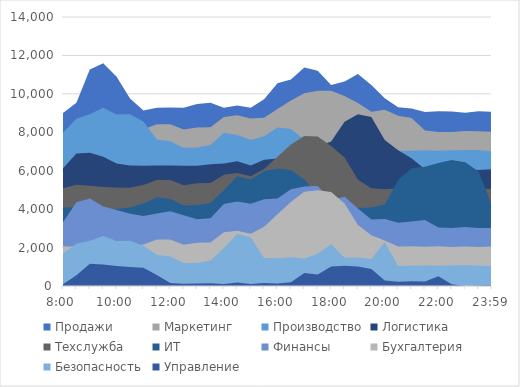
| Category | Продажи | Маркетинг | Производство | Логистика | Техслужба | ИТ | Финансы | Бухгалтерия | Безопасность | Управление |
|---|---|---|---|---|---|---|---|---|---|---|
| 0.333333333333333 | 9000 | 8000 | 7979 | 6124 | 5086 | 4100 | 3319 | 2075 | 1685 | 87 |
| nan | 9532 | 8000 | 8708 | 6890 | 5273 | 4078 | 4364 | 2037 | 2196 | 563 |
| nan | 11273 | 8118 | 8943 | 6930 | 5218 | 4051 | 4556 | 2042 | 2360 | 1156 |
| nan | 11593 | 8053 | 9282 | 6723 | 5153 | 4048 | 4132 | 2043 | 2597 | 1123 |
| 0.416666666666667 | 10887 | 8020 | 8920 | 6376 | 5120 | 4002 | 3960 | 2014 | 2344 | 1046 |
| nan | 9755 | 8009 | 8940 | 6271 | 5109 | 4084 | 3755 | 2042 | 2358 | 985 |
| nan | 9137 | 8163 | 8559 | 6259 | 5263 | 4292 | 3637 | 2163 | 2091 | 950 |
| nan | 9276 | 8418 | 7625 | 6272 | 5518 | 4625 | 3776 | 2418 | 1625 | 567 |
| 0.5 | 9287 | 8419 | 7531 | 6268 | 5519 | 4531 | 3887 | 2419 | 1531 | 156 |
| nan | 9276 | 8145 | 7198 | 6263 | 5245 | 4198 | 3676 | 2145 | 1198 | 111 |
| nan | 9472 | 8249 | 7203 | 6253 | 5349 | 4203 | 3472 | 2249 | 1203 | 135 |
| nan | 9532 | 8261 | 7332 | 6337 | 5361 | 4332 | 3532 | 2261 | 1332 | 138 |
| 0.583333333333333 | 9273 | 8793 | 7979 | 6376 | 5793 | 4979 | 4273 | 2793 | 1979 | 103 |
| nan | 9393 | 8881 | 7854 | 6487 | 5881 | 5708 | 4393 | 2881 | 2708 | 188 |
| nan | 9276 | 8717 | 7617 | 6276 | 5717 | 5543 | 4276 | 2717 | 2543 | 106 |
| nan | 9718 | 8762 | 7793 | 6572 | 6089 | 5982 | 4518 | 3089 | 1462 | 157 |
| 0.666666666666667 | 10549 | 9212 | 8248 | 6632 | 6731 | 6120 | 4549 | 3731 | 1447 | 131 |
| nan | 10749 | 9658 | 8176 | 7273 | 7369 | 6040 | 5033 | 4369 | 1490 | 197 |
| nan | 11376 | 10032 | 7624 | 7393 | 7803 | 5559 | 5182 | 4903 | 1429 | 674 |
| nan | 11200 | 10160 | 7273 | 7276 | 7786 | 4683 | 5200 | 4986 | 1683 | 603 |
| 0.75 | 10465 | 10162 | 7098 | 7518 | 7289 | 4180 | 4465 | 4889 | 2180 | 1010 |
| nan | 10643 | 9885 | 7030 | 8549 | 6693 | 4017 | 4643 | 4293 | 1471 | 1058 |
| nan | 11035 | 9525 | 7050 | 8933 | 5525 | 4055 | 4035 | 3178 | 1483 | 1012 |
| nan | 10462 | 9075 | 7099 | 8802 | 5090 | 4079 | 3462 | 2635 | 1400 | 886 |
| 0.833333333333333 | 9769 | 9168 | 7097 | 7600 | 5041 | 4246 | 3490 | 2368 | 2283 | 287 |
| nan | 9303 | 8855 | 7033 | 7065 | 5074 | 5499 | 3294 | 2057 | 1040 | 219 |
| nan | 9238 | 8743 | 7040 | 6643 | 5015 | 6122 | 3353 | 2064 | 1056 | 241 |
| nan | 9059 | 8096 | 7069 | 6075 | 5081 | 6211 | 3434 | 2037 | 1071 | 240 |
| 0.916666666666667 | 9090 | 8019 | 7041 | 6062 | 5024 | 6400 | 3051 | 2067 | 1053 | 512 |
| nan | 9080 | 8019 | 7064 | 6005 | 5037 | 6561 | 3020 | 2029 | 1061 | 85 |
| nan | 9011 | 8066 | 7082 | 6052 | 5030 | 6447 | 3077 | 2050 | 1099 | 6 |
| nan | 9096 | 8049 | 7074 | 6041 | 5059 | 5963 | 3021 | 2026 | 1060 | 27 |
| 0.9993055555555556 | 9071 | 8024 | 7012 | 6085 | 5048 | 4170 | 3013 | 2057 | 1044 | 54 |